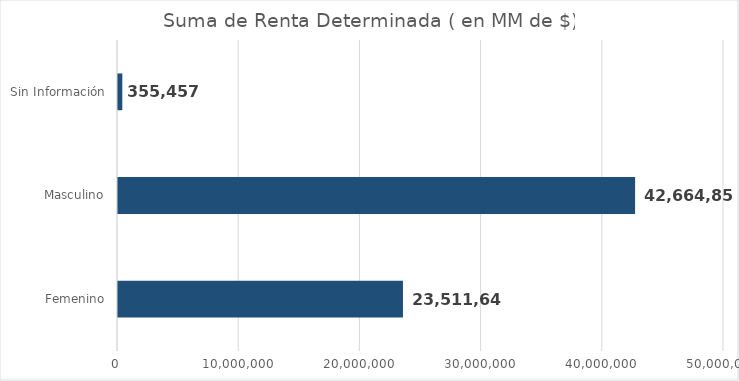
| Category | Series 0 |
|---|---|
| Femenino | 23511647.5 |
| Masculino | 42664852.3 |
| Sin Información | 355457.4 |